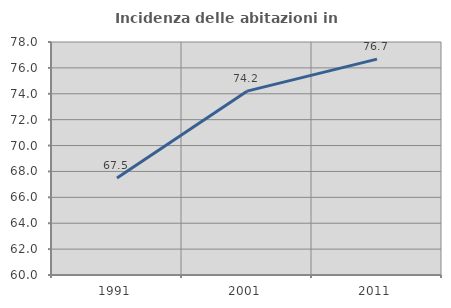
| Category | Incidenza delle abitazioni in proprietà  |
|---|---|
| 1991.0 | 67.487 |
| 2001.0 | 74.202 |
| 2011.0 | 76.676 |